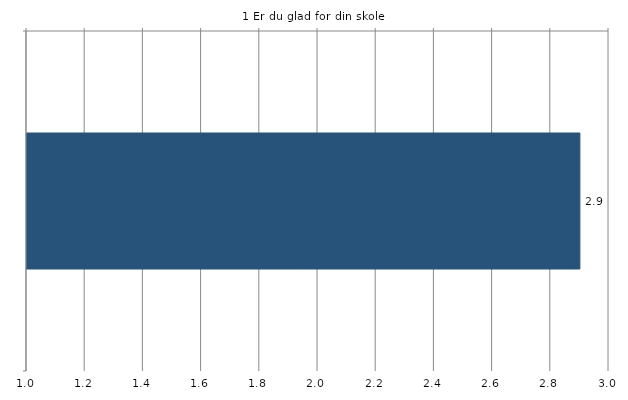
| Category | Gns. |
|---|---|
|   | 2.9 |